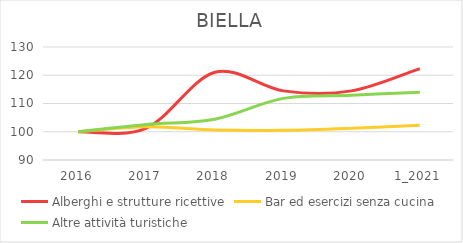
| Category | Alberghi e strutture ricettive | Bar ed esercizi senza cucina | Altre attività turistiche |
|---|---|---|---|
| 2016 | 100 | 100 | 100 |
| 2017 | 101.316 | 101.738 | 102.583 |
| 2018 | 121.053 | 100.608 | 104.428 |
| 2019 | 114.474 | 100.521 | 111.808 |
| 2020 | 114.474 | 101.216 | 112.915 |
| 1_2021 | 122.368 | 102.259 | 114.022 |